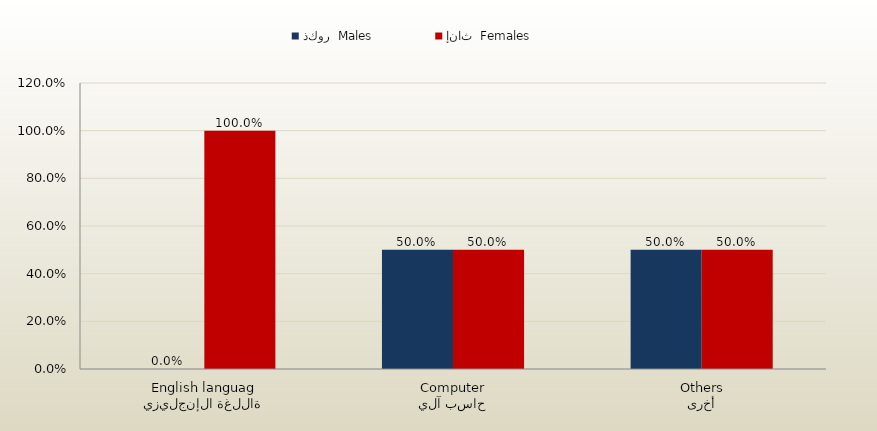
| Category | ذكور  Males | إناث  Females |
|---|---|---|
| اللغة الإنجليزية
English language | 0 | 1 |
| حاسب آلي
Computer | 0.5 | 0.5 |
| أخرى
Others | 0.5 | 0.5 |